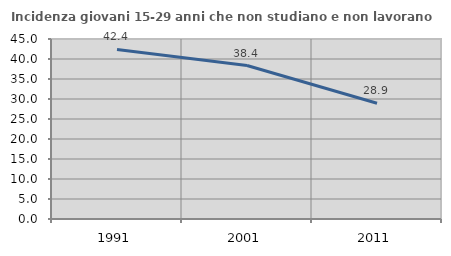
| Category | Incidenza giovani 15-29 anni che non studiano e non lavorano  |
|---|---|
| 1991.0 | 42.393 |
| 2001.0 | 38.372 |
| 2011.0 | 28.936 |